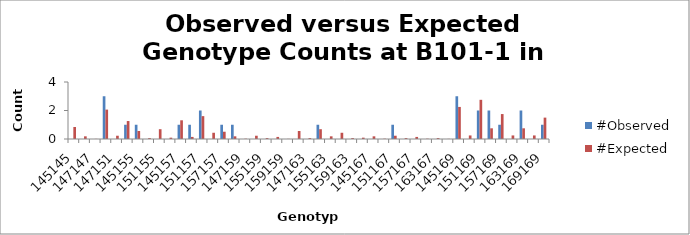
| Category | #Observed | #Expected |
|---|---|---|
| 145145.0 | 0 | 0.844 |
| 145147.0 | 0 | 0.188 |
| 147147.0 | 0 | 0.01 |
| 145151.0 | 3 | 2.062 |
| 147151.0 | 0 | 0.229 |
| 151151.0 | 1 | 1.26 |
| 145155.0 | 1 | 0.562 |
| 147155.0 | 0 | 0.062 |
| 151155.0 | 0 | 0.688 |
| 155155.0 | 0 | 0.094 |
| 145157.0 | 1 | 1.312 |
| 147157.0 | 1 | 0.146 |
| 151157.0 | 2 | 1.604 |
| 155157.0 | 0 | 0.438 |
| 157157.0 | 1 | 0.51 |
| 145159.0 | 1 | 0.188 |
| 147159.0 | 0 | 0.021 |
| 151159.0 | 0 | 0.229 |
| 155159.0 | 0 | 0.062 |
| 157159.0 | 0 | 0.146 |
| 159159.0 | 0 | 0.01 |
| 145163.0 | 0 | 0.562 |
| 147163.0 | 0 | 0.062 |
| 151163.0 | 1 | 0.688 |
| 155163.0 | 0 | 0.188 |
| 157163.0 | 0 | 0.438 |
| 159163.0 | 0 | 0.062 |
| 163163.0 | 0 | 0.094 |
| 145167.0 | 0 | 0.188 |
| 147167.0 | 0 | 0.021 |
| 151167.0 | 1 | 0.229 |
| 155167.0 | 0 | 0.062 |
| 157167.0 | 0 | 0.146 |
| 159167.0 | 0 | 0.021 |
| 163167.0 | 0 | 0.062 |
| 167167.0 | 0 | 0.01 |
| 145169.0 | 3 | 2.25 |
| 147169.0 | 0 | 0.25 |
| 151169.0 | 2 | 2.75 |
| 155169.0 | 2 | 0.75 |
| 157169.0 | 1 | 1.75 |
| 159169.0 | 0 | 0.25 |
| 163169.0 | 2 | 0.75 |
| 167169.0 | 0 | 0.25 |
| 169169.0 | 1 | 1.5 |